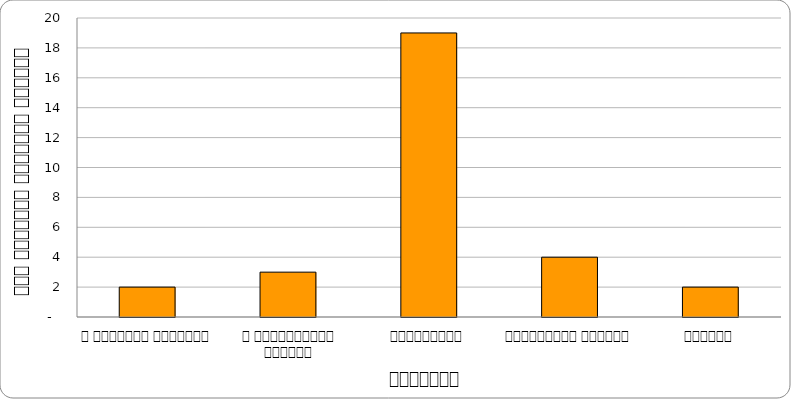
| Category | सुरक्षा |
|---|---|
| द हिमालयन टाइम्स् | 2 |
| द काठमाण्डौं पोस्ट् | 3 |
| कान्तिपुर | 19 |
| अन्नपूर्ण पोस्ट् | 4 |
| नागरिक | 2 |